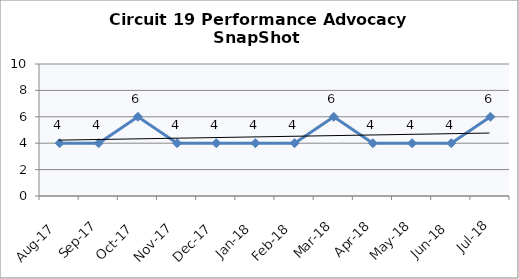
| Category | Circuit 19 |
|---|---|
| Aug-17 | 4 |
| Sep-17 | 4 |
| Oct-17 | 6 |
| Nov-17 | 4 |
| Dec-17 | 4 |
| Jan-18 | 4 |
| Feb-18 | 4 |
| Mar-18 | 6 |
| Apr-18 | 4 |
| May-18 | 4 |
| Jun-18 | 4 |
| Jul-18 | 6 |